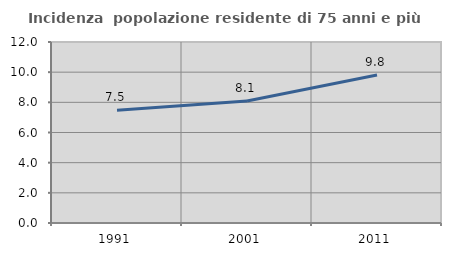
| Category | Incidenza  popolazione residente di 75 anni e più |
|---|---|
| 1991.0 | 7.475 |
| 2001.0 | 8.09 |
| 2011.0 | 9.816 |